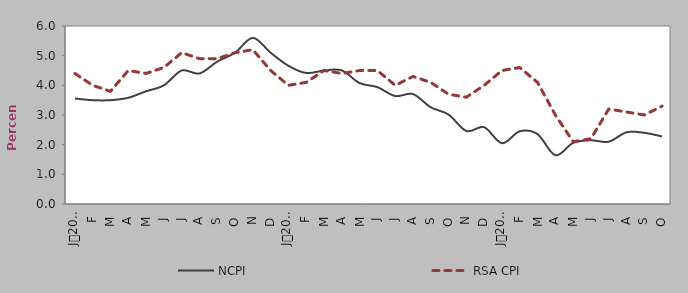
| Category | NCPI | RSA CPI |
|---|---|---|
| 0 | 3.555 | 4.4 |
| 1900-01-01 | 3.5 | 4 |
| 1900-01-02 | 3.5 | 3.8 |
| 1900-01-03 | 3.581 | 4.5 |
| 1900-01-04 | 3.8 | 4.4 |
| 1900-01-05 | 4 | 4.6 |
| 1900-01-06 | 4.5 | 5.1 |
| 1900-01-07 | 4.4 | 4.9 |
| 1900-01-08 | 4.8 | 4.9 |
| 1900-01-09 | 5.1 | 5.1 |
| 1900-01-10 | 5.6 | 5.2 |
| 1900-01-11 | 5.1 | 4.5 |
| 1900-01-12 | 4.658 | 4 |
| 1900-01-13 | 4.416 | 4.1 |
| 1900-01-14 | 4.498 | 4.5 |
| 1900-01-15 | 4.503 | 4.4 |
| 1900-01-16 | 4.076 | 4.5 |
| 1900-01-17 | 3.939 | 4.5 |
| 1900-01-18 | 3.639 | 4 |
| 1900-01-19 | 3.705 | 4.3 |
| 1900-01-20 | 3.259 | 4.1 |
| 1900-01-21 | 3.015 | 3.7 |
| 1900-01-22 | 2.461 | 3.6 |
| 1900-01-23 | 2.588 | 4 |
| 1900-01-24 | 2.05 | 4.5 |
| 1900-01-25 | 2.45 | 4.6 |
| 1900-01-26 | 2.354 | 4.1 |
| 1900-01-27 | 1.643 | 3 |
| 1900-01-28 | 2.06 | 2.1 |
| 1900-01-29 | 2.147 | 2.2 |
| 1900-01-30 | 2.1 | 3.2 |
| 1900-01-31 | 2.416 | 3.1 |
| 1900-02-01 | 2.4 | 3 |
| 1900-02-02 | 2.277 | 3.3 |